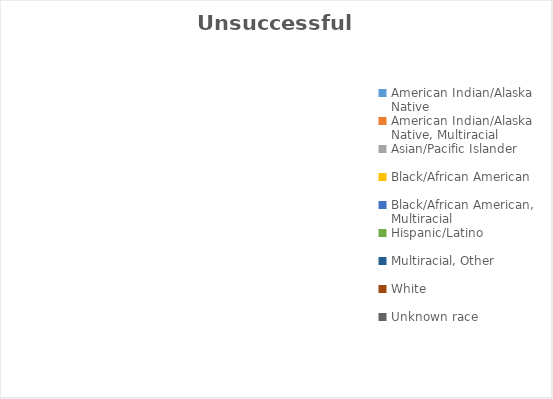
| Category | Unsuccessful Outcome |
|---|---|
| American Indian/Alaska Native  | 0 |
| American Indian/Alaska Native, Multiracial | 0 |
| Asian/Pacific Islander | 0 |
| Black/African American | 0 |
| Black/African American, Multiracial | 0 |
| Hispanic/Latino  | 0 |
| Multiracial, Other | 0 |
| White  | 0 |
| Unknown race | 0 |